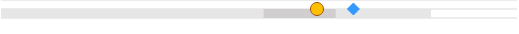
| Category | left | mid start | mid end | right |
|---|---|---|---|---|
| 0 | 0 | 0.61 | 0.169 | 0.221 |